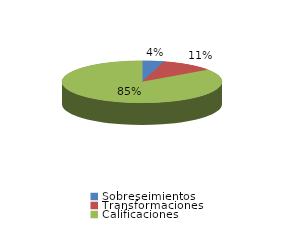
| Category | Series 0 |
|---|---|
| Sobreseimientos | 83 |
| Transformaciones | 201 |
| Calificaciones | 1588 |